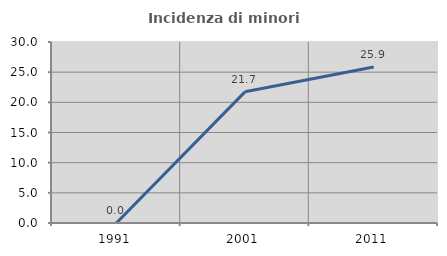
| Category | Incidenza di minori stranieri |
|---|---|
| 1991.0 | 0 |
| 2001.0 | 21.739 |
| 2011.0 | 25.862 |